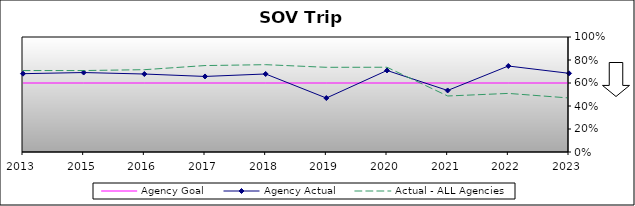
| Category | Agency Goal | Agency Actual | Actual - ALL Agencies |
|---|---|---|---|
| 2013.0 | 0.6 | 0.681 | 0.708 |
| 2015.0 | 0.6 | 0.691 | 0.708 |
| 2016.0 | 0.6 | 0.678 | 0.716 |
| 2017.0 | 0.6 | 0.657 | 0.752 |
| 2018.0 | 0.6 | 0.678 | 0.759 |
| 2019.0 | 0.6 | 0.469 | 0.736 |
| 2020.0 | 0.6 | 0.709 | 0.737 |
| 2021.0 | 0.6 | 0.535 | 0.487 |
| 2022.0 | 0.6 | 0.748 | 0.509 |
| 2023.0 | 0.6 | 0.684 | 0.47 |